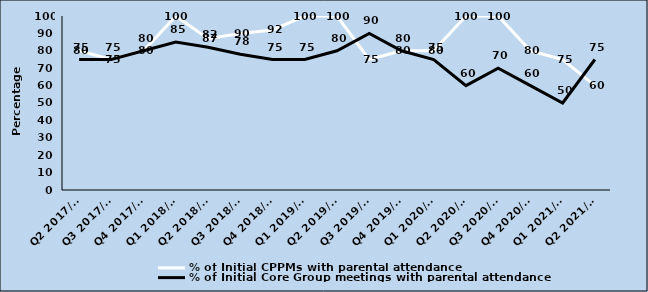
| Category | % of Initial CPPMs with parental attendance | % of Initial Core Group meetings with parental attendance |
|---|---|---|
| Q2 2017/18 | 80 | 75 |
| Q3 2017/18 | 75 | 75 |
| Q4 2017/18 | 80 | 80 |
| Q1 2018/19 | 100 | 85 |
| Q2 2018/19 | 87 | 82 |
| Q3 2018/19 | 90 | 78 |
| Q4 2018/19 | 92 | 75 |
| Q1 2019/20 | 100 | 75 |
| Q2 2019/20 | 100 | 80 |
| Q3 2019/20 | 75 | 90 |
| Q4 2019/20 | 80 | 80 |
| Q1 2020/21 | 80 | 75 |
| Q2 2020/21 | 100 | 60 |
| Q3 2020/21 | 100 | 70 |
| Q4 2020/21 | 80 | 60 |
| Q1 2021/22 | 75 | 50 |
| Q2 2021/22 | 60 | 75 |